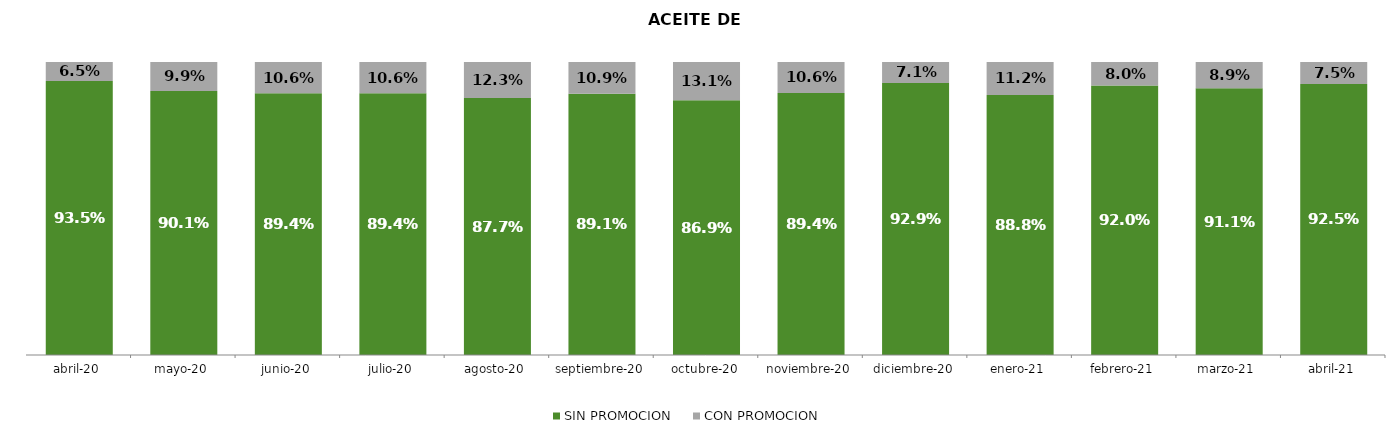
| Category | SIN PROMOCION   | CON PROMOCION   |
|---|---|---|
| 2020-04-01 | 0.935 | 0.065 |
| 2020-05-01 | 0.901 | 0.099 |
| 2020-06-01 | 0.894 | 0.106 |
| 2020-07-01 | 0.894 | 0.106 |
| 2020-08-01 | 0.877 | 0.123 |
| 2020-09-01 | 0.891 | 0.109 |
| 2020-10-01 | 0.869 | 0.131 |
| 2020-11-01 | 0.894 | 0.106 |
| 2020-12-01 | 0.929 | 0.071 |
| 2021-01-01 | 0.888 | 0.112 |
| 2021-02-01 | 0.92 | 0.08 |
| 2021-03-01 | 0.911 | 0.089 |
| 2021-04-01 | 0.925 | 0.075 |